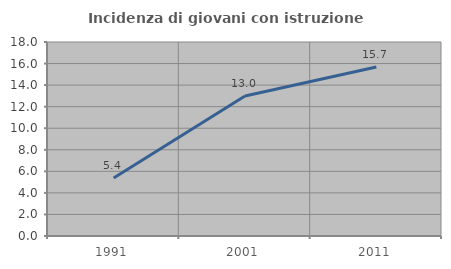
| Category | Incidenza di giovani con istruzione universitaria |
|---|---|
| 1991.0 | 5.385 |
| 2001.0 | 12.996 |
| 2011.0 | 15.679 |